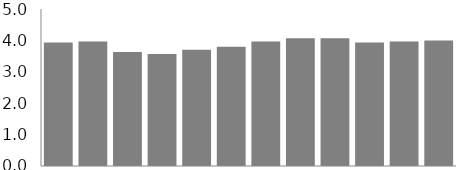
| Category | Customer feedback |
|---|---|
| 0 | 3.933 |
| 1 | 3.967 |
| 2 | 3.633 |
| 3 | 3.567 |
| 4 | 3.7 |
| 5 | 3.8 |
| 6 | 3.967 |
| 7 | 4.067 |
| 8 | 4.067 |
| 9 | 3.933 |
| 10 | 3.967 |
| 11 | 4 |